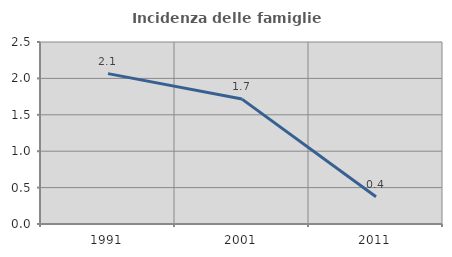
| Category | Incidenza delle famiglie numerose |
|---|---|
| 1991.0 | 2.066 |
| 2001.0 | 1.716 |
| 2011.0 | 0.374 |